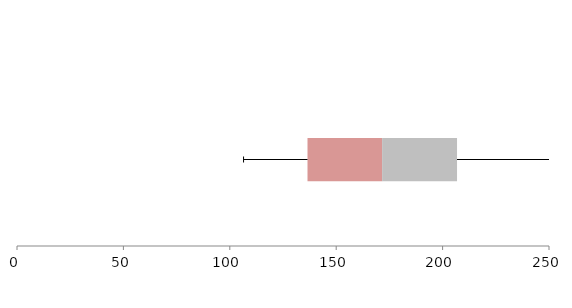
| Category | Series 1 | Series 2 | Series 3 |
|---|---|---|---|
| 0 | 136.512 | 35.068 | 35.2 |